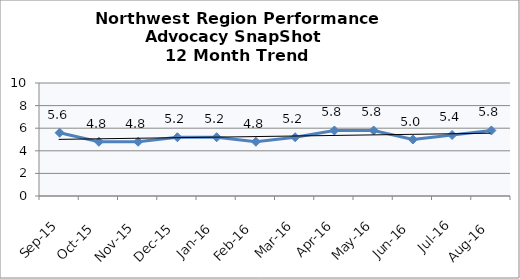
| Category | Northwest Region |
|---|---|
| Sep-15 | 5.6 |
| Oct-15 | 4.8 |
| Nov-15 | 4.8 |
| Dec-15 | 5.2 |
| Jan-16 | 5.2 |
| Feb-16 | 4.8 |
| Mar-16 | 5.2 |
| Apr-16 | 5.8 |
| May-16 | 5.8 |
| Jun-16 | 5 |
| Jul-16 | 5.4 |
| Aug-16 | 5.8 |